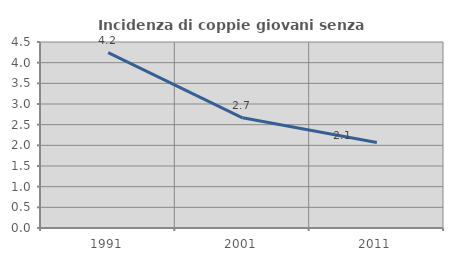
| Category | Incidenza di coppie giovani senza figli |
|---|---|
| 1991.0 | 4.242 |
| 2001.0 | 2.667 |
| 2011.0 | 2.069 |